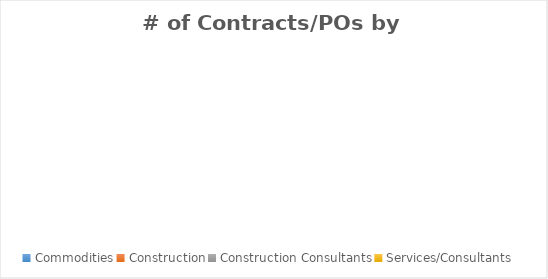
| Category | # of Contracts/POs |
|---|---|
| Commodities | 0 |
| Construction | 0 |
| Construction Consultants | 0 |
| Services/Consultants | 0 |